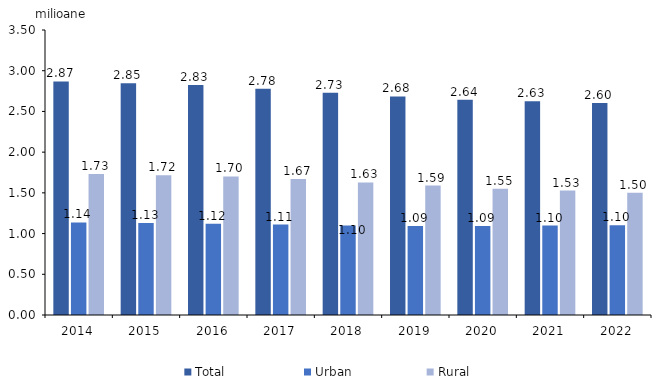
| Category | Total  | Urban | Rural |
|---|---|---|---|
| 2014.0 | 2.869 | 1.137 | 1.732 |
| 2015.0 | 2.846 | 1.129 | 1.716 |
| 2016.0 | 2.825 | 1.122 | 1.702 |
| 2017.0 | 2.78 | 1.111 | 1.669 |
| 2018.0 | 2.729 | 1.1 | 1.628 |
| 2019.0 | 2.684 | 1.094 | 1.59 |
| 2020.0 | 2.643 | 1.092 | 1.55 |
| 2021.0 | 2.626 | 1.098 | 1.528 |
| 2022.0 | 2.603 | 1.102 | 1.501 |